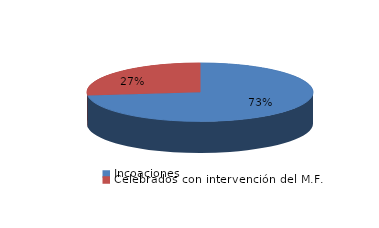
| Category | Series 0 |
|---|---|
| Incoaciones | 4902 |
| Celebrados con intervención del M.F. | 1799 |